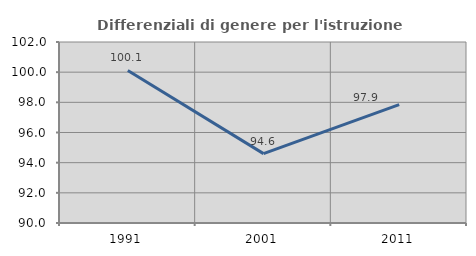
| Category | Differenziali di genere per l'istruzione superiore |
|---|---|
| 1991.0 | 100.117 |
| 2001.0 | 94.601 |
| 2011.0 | 97.853 |